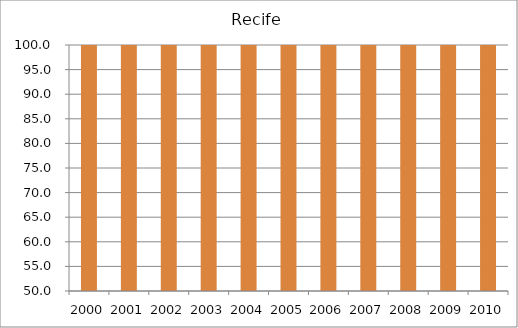
| Category | Recife |
|---|---|
| 2000.0 | 144.07 |
| 2001.0 | 129.86 |
| 2002.0 | 139.34 |
| 2003.0 | 141.11 |
| 2004.0 | 130.15 |
| 2005.0 | 121.42 |
| 2006.0 | 122.78 |
| 2007.0 | 122.21 |
| 2008.0 | 122.95 |
| 2009.0 | 119.37 |
| 2010.0 | 117.39 |